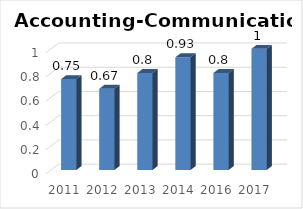
| Category | Series 0 |
|---|---|
| 2011.0 | 0.75 |
| 2012.0 | 0.67 |
| 2013.0 | 0.8 |
| 2014.0 | 0.93 |
| 2016.0 | 0.8 |
| 2017.0 | 1 |